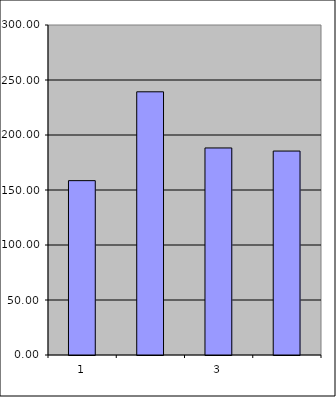
| Category | Series 0 |
|---|---|
| 0 | 158.5 |
| 1 | 239.269 |
| 2 | 188.213 |
| 3 | 185.403 |